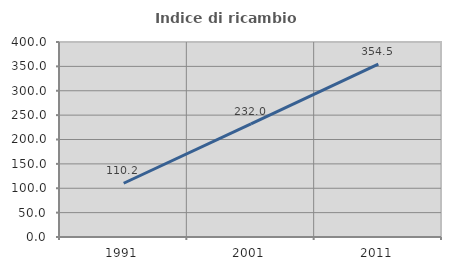
| Category | Indice di ricambio occupazionale  |
|---|---|
| 1991.0 | 110.233 |
| 2001.0 | 231.967 |
| 2011.0 | 354.545 |